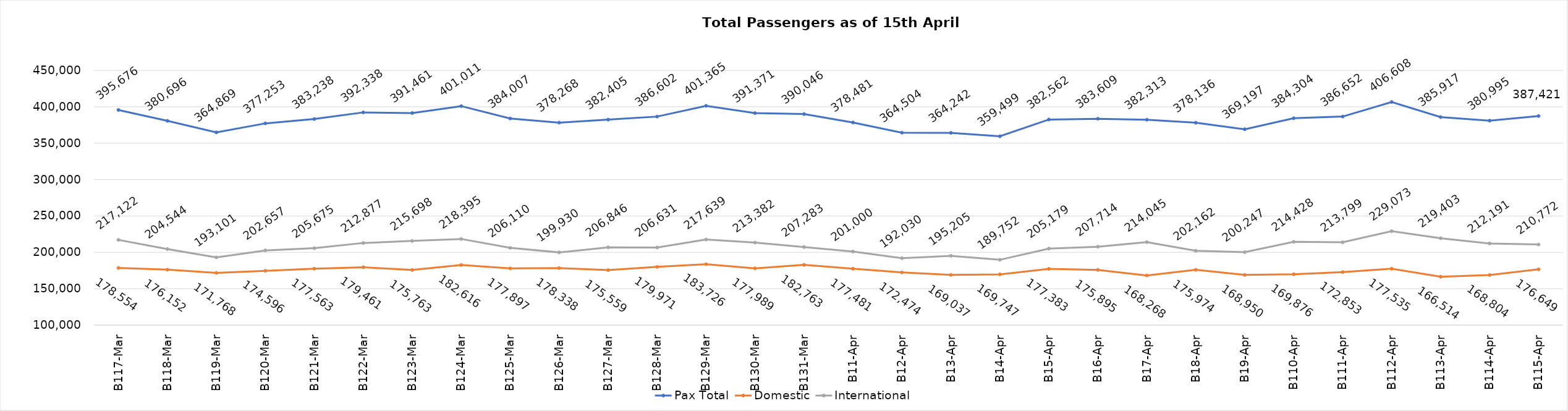
| Category | Pax Total | Domestic | International |
|---|---|---|---|
| 2024-03-17 | 395676 | 178554 | 217122 |
| 2024-03-18 | 380696 | 176152 | 204544 |
| 2024-03-19 | 364869 | 171768 | 193101 |
| 2024-03-20 | 377253 | 174596 | 202657 |
| 2024-03-21 | 383238 | 177563 | 205675 |
| 2024-03-22 | 392338 | 179461 | 212877 |
| 2024-03-23 | 391461 | 175763 | 215698 |
| 2024-03-24 | 401011 | 182616 | 218395 |
| 2024-03-25 | 384007 | 177897 | 206110 |
| 2024-03-26 | 378268 | 178338 | 199930 |
| 2024-03-27 | 382405 | 175559 | 206846 |
| 2024-03-28 | 386602 | 179971 | 206631 |
| 2024-03-29 | 401365 | 183726 | 217639 |
| 2024-03-30 | 391371 | 177989 | 213382 |
| 2024-03-31 | 390046 | 182763 | 207283 |
| 2024-04-01 | 378481 | 177481 | 201000 |
| 2024-04-02 | 364504 | 172474 | 192030 |
| 2024-04-03 | 364242 | 169037 | 195205 |
| 2024-04-04 | 359499 | 169747 | 189752 |
| 2024-04-05 | 382562 | 177383 | 205179 |
| 2024-04-06 | 383609 | 175895 | 207714 |
| 2024-04-07 | 382313 | 168268 | 214045 |
| 2024-04-08 | 378136 | 175974 | 202162 |
| 2024-04-09 | 369197 | 168950 | 200247 |
| 2024-04-10 | 384304 | 169876 | 214428 |
| 2024-04-11 | 386652 | 172853 | 213799 |
| 2024-04-12 | 406608 | 177535 | 229073 |
| 2024-04-13 | 385917 | 166514 | 219403 |
| 2024-04-14 | 380995 | 168804 | 212191 |
| 2024-04-15 | 387421 | 176649 | 210772 |